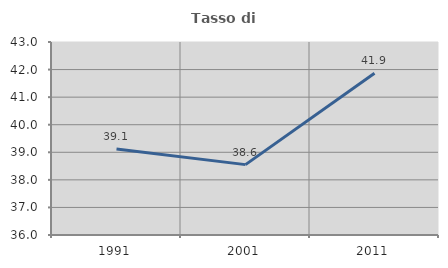
| Category | Tasso di occupazione   |
|---|---|
| 1991.0 | 39.119 |
| 2001.0 | 38.553 |
| 2011.0 | 41.865 |